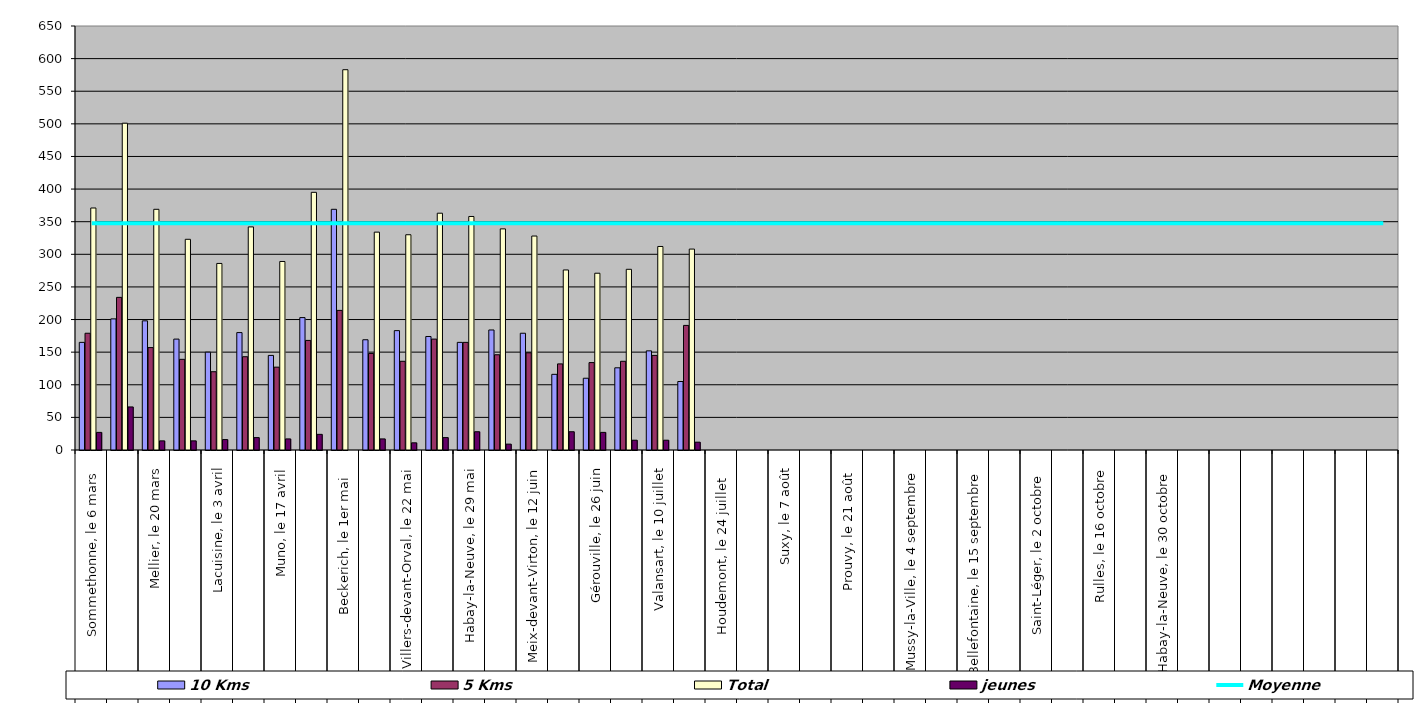
| Category | 10 Kms | 5 Kms | Total | jeunes |
|---|---|---|---|---|
| 0 | 165 | 179 | 371 | 27 |
| 1 | 201 | 234 | 501 | 66 |
| 2 | 198 | 157 | 369 | 14 |
| 3 | 170 | 139 | 323 | 14 |
| 4 | 150 | 120 | 286 | 16 |
| 5 | 180 | 143 | 342 | 19 |
| 6 | 145 | 127 | 289 | 17 |
| 7 | 203 | 168 | 395 | 24 |
| 8 | 369 | 214 | 583 | 0 |
| 9 | 169 | 148 | 334 | 17 |
| 10 | 183 | 136 | 330 | 11 |
| 11 | 174 | 170 | 363 | 19 |
| 12 | 165 | 165 | 358 | 28 |
| 13 | 184 | 146 | 339 | 9 |
| 14 | 179 | 149 | 328 | 0 |
| 15 | 116 | 132 | 276 | 28 |
| 16 | 110 | 134 | 271 | 27 |
| 17 | 126 | 136 | 277 | 15 |
| 18 | 152 | 145 | 312 | 15 |
| 19 | 105 | 191 | 308 | 12 |
| 20 | 0 | 0 | 0 | 0 |
| 21 | 0 | 0 | 0 | 0 |
| 22 | 0 | 0 | 0 | 0 |
| 23 | 0 | 0 | 0 | 0 |
| 24 | 0 | 0 | 0 | 0 |
| 25 | 0 | 0 | 0 | 0 |
| 26 | 0 | 0 | 0 | 0 |
| 27 | 0 | 0 | 0 | 0 |
| 28 | 0 | 0 | 0 | 0 |
| 29 | 0 | 0 | 0 | 0 |
| 30 | 0 | 0 | 0 | 0 |
| 31 | 0 | 0 | 0 | 0 |
| 32 | 0 | 0 | 0 | 0 |
| 33 | 0 | 0 | 0 | 0 |
| 34 | 0 | 0 | 0 | 0 |
| 35 | 0 | 0 | 0 | 0 |
| 36 | 0 | 0 | 0 | 0 |
| 37 | 0 | 0 | 0 | 0 |
| 38 | 0 | 0 | 0 | 0 |
| 39 | 0 | 0 | 0 | 0 |
| 40 | 0 | 0 | 0 | 0 |
| 41 | 0 | 0 | 0 | 0 |